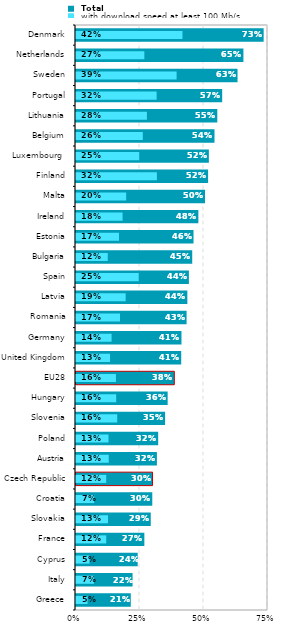
| Category |  Total |
|---|---|
| Greece | 0.214 |
| Italy | 0.221 |
| Cyprus | 0.241 |
| France | 0.267 |
| Slovakia | 0.292 |
| Croatia | 0.298 |
| Czech Republic | 0.299 |
| Austria | 0.316 |
| Poland | 0.321 |
| Slovenia | 0.348 |
| Hungary | 0.358 |
| EU28 | 0.384 |
| United Kingdom | 0.411 |
| Germany | 0.412 |
| Romania | 0.432 |
| Latvia | 0.435 |
| Spain | 0.441 |
| Bulgaria | 0.454 |
| Estonia | 0.459 |
| Ireland | 0.478 |
| Malta | 0.504 |
| Finland | 0.516 |
| Luxembourg  | 0.519 |
| Belgium | 0.541 |
| Lithuania | 0.552 |
| Portugal | 0.571 |
| Sweden | 0.631 |
| Netherlands | 0.654 |
| Denmark | 0.733 |